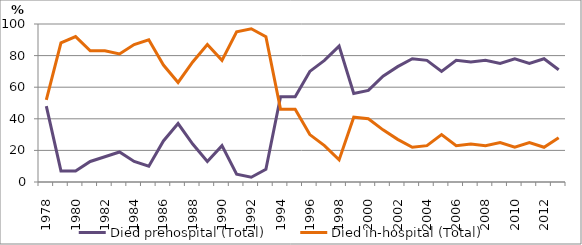
| Category | Died prehospital (Total) | Died in-hospital (Total) |
|---|---|---|
| 1978.0 | 48 | 52 |
| 1979.0 | 7 | 88 |
| 1980.0 | 7 | 92 |
| 1981.0 | 13 | 83 |
| 1982.0 | 16 | 83 |
| 1983.0 | 19 | 81 |
| 1984.0 | 13 | 87 |
| 1985.0 | 10 | 90 |
| 1986.0 | 26 | 74 |
| 1987.0 | 37 | 63 |
| 1988.0 | 24 | 76 |
| 1989.0 | 13 | 87 |
| 1990.0 | 23 | 77 |
| 1991.0 | 5 | 95 |
| 1992.0 | 3 | 97 |
| 1993.0 | 8 | 92 |
| 1994.0 | 54 | 46 |
| 1995.0 | 54 | 46 |
| 1996.0 | 70 | 30 |
| 1997.0 | 77 | 23 |
| 1998.0 | 86 | 14 |
| 1999.0 | 56 | 41 |
| 2000.0 | 58 | 40 |
| 2001.0 | 67 | 33 |
| 2002.0 | 73 | 27 |
| 2003.0 | 78 | 22 |
| 2004.0 | 77 | 23 |
| 2005.0 | 70 | 30 |
| 2006.0 | 77 | 23 |
| 2007.0 | 76 | 24 |
| 2008.0 | 77 | 23 |
| 2009.0 | 75 | 25 |
| 2010.0 | 78 | 22 |
| 2011.0 | 75 | 25 |
| 2012.0 | 78 | 22 |
| 2013.0 | 71 | 28 |